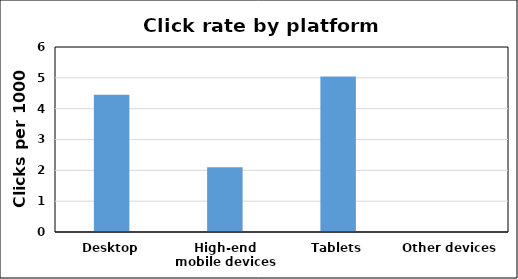
| Category | Series 0 |
|---|---|
| Desktop | 4.455 |
| High-end mobile devices | 2.103 |
| Tablets | 5.04 |
| Other devices | 0 |